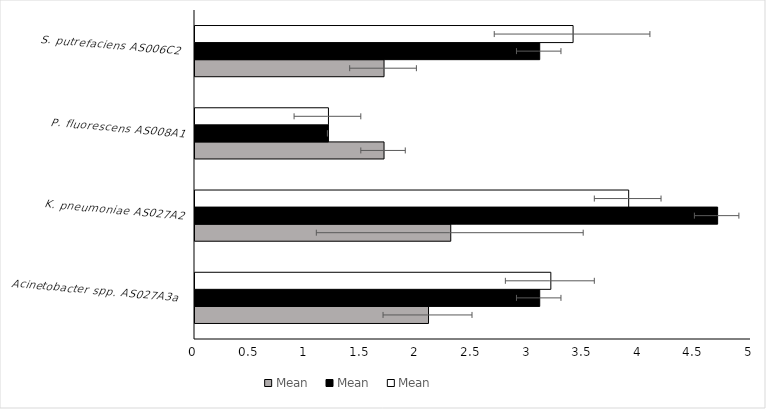
| Category | Mean |
|---|---|
| Acinetobacter spp. AS027A3a  | 3.2 |
| K. pneumoniae AS027A2 | 3.9 |
| P. fluorescens AS008A1 | 1.2 |
| S. putrefaciens AS006C2 | 3.4 |